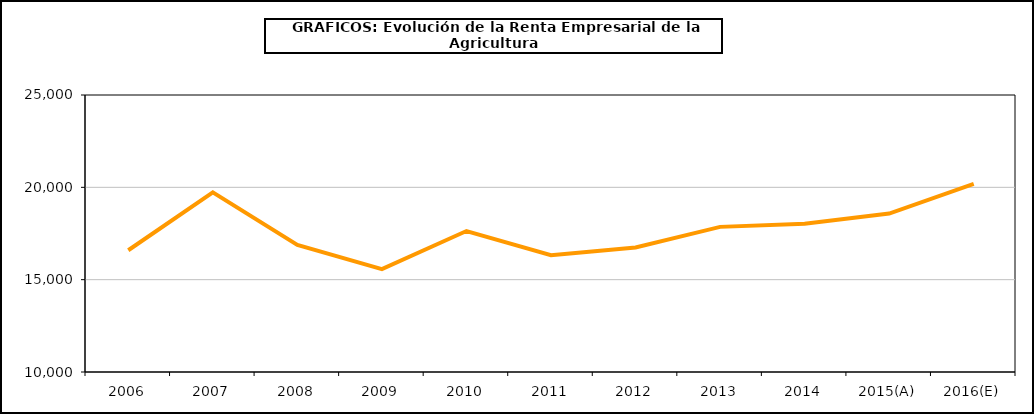
| Category | renta empresarial |
|---|---|
| 2006 | 16591.901 |
| 2007 | 19725.27 |
| 2008 | 16877.818 |
| 2009 | 15568.835 |
| 2010 | 17633.246 |
| 2011 | 16322.948 |
| 2012 | 16739.148 |
| 2013 | 17858.951 |
| 2014 | 18029.917 |
| 2015(A) | 18581.162 |
| 2016(E) | 20190.279 |